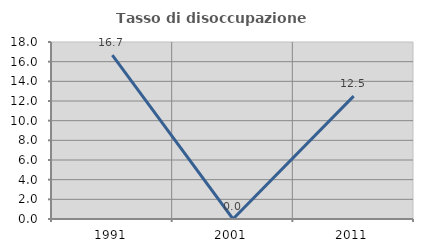
| Category | Tasso di disoccupazione giovanile  |
|---|---|
| 1991.0 | 16.667 |
| 2001.0 | 0 |
| 2011.0 | 12.5 |